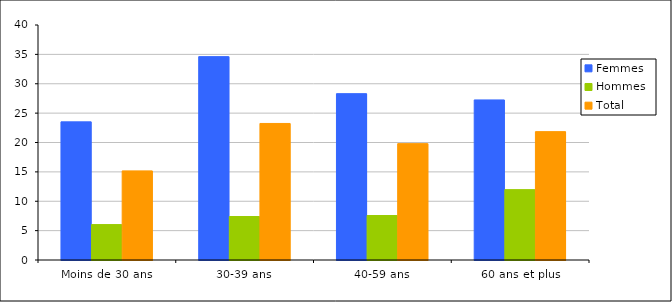
| Category | Femmes | Hommes | Total |
|---|---|---|---|
| Moins de 30 ans | 23.513 | 6.029 | 15.169 |
| 30-39 ans | 34.617 | 7.401 | 23.241 |
| 40-59 ans | 28.313 | 7.571 | 19.806 |
| 60 ans et plus | 27.245 | 11.978 | 21.85 |